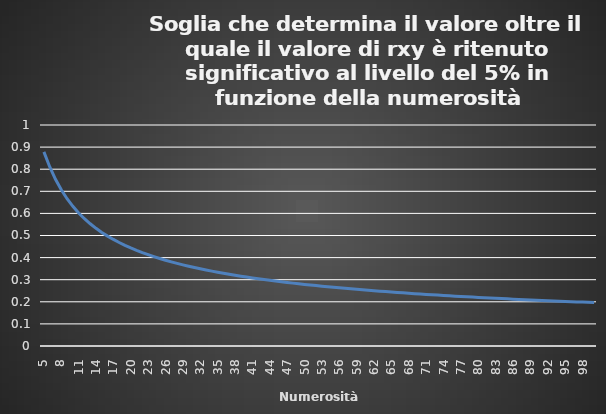
| Category | Series 0 |
|---|---|
| 5.0 | 0.878 |
| 6.0 | 0.811 |
| 7.0 | 0.754 |
| 8.0 | 0.707 |
| 9.0 | 0.666 |
| 10.0 | 0.632 |
| 11.0 | 0.602 |
| 12.0 | 0.576 |
| 13.0 | 0.553 |
| 14.0 | 0.532 |
| 15.0 | 0.514 |
| 16.0 | 0.497 |
| 17.0 | 0.482 |
| 18.0 | 0.468 |
| 19.0 | 0.456 |
| 20.0 | 0.444 |
| 21.0 | 0.433 |
| 22.0 | 0.423 |
| 23.0 | 0.413 |
| 24.0 | 0.404 |
| 25.0 | 0.396 |
| 26.0 | 0.388 |
| 27.0 | 0.381 |
| 28.0 | 0.374 |
| 29.0 | 0.367 |
| 30.0 | 0.361 |
| 31.0 | 0.355 |
| 32.0 | 0.349 |
| 33.0 | 0.344 |
| 34.0 | 0.339 |
| 35.0 | 0.334 |
| 36.0 | 0.329 |
| 37.0 | 0.325 |
| 38.0 | 0.32 |
| 39.0 | 0.316 |
| 40.0 | 0.312 |
| 41.0 | 0.308 |
| 42.0 | 0.304 |
| 43.0 | 0.301 |
| 44.0 | 0.297 |
| 45.0 | 0.294 |
| 46.0 | 0.291 |
| 47.0 | 0.288 |
| 48.0 | 0.285 |
| 49.0 | 0.282 |
| 50.0 | 0.279 |
| 51.0 | 0.276 |
| 52.0 | 0.273 |
| 53.0 | 0.271 |
| 54.0 | 0.268 |
| 55.0 | 0.266 |
| 56.0 | 0.263 |
| 57.0 | 0.261 |
| 58.0 | 0.259 |
| 59.0 | 0.256 |
| 60.0 | 0.254 |
| 61.0 | 0.252 |
| 62.0 | 0.25 |
| 63.0 | 0.248 |
| 64.0 | 0.246 |
| 65.0 | 0.244 |
| 66.0 | 0.242 |
| 67.0 | 0.24 |
| 68.0 | 0.239 |
| 69.0 | 0.237 |
| 70.0 | 0.235 |
| 71.0 | 0.234 |
| 72.0 | 0.232 |
| 73.0 | 0.23 |
| 74.0 | 0.229 |
| 75.0 | 0.227 |
| 76.0 | 0.226 |
| 77.0 | 0.224 |
| 78.0 | 0.223 |
| 79.0 | 0.221 |
| 80.0 | 0.22 |
| 81.0 | 0.219 |
| 82.0 | 0.217 |
| 83.0 | 0.216 |
| 84.0 | 0.215 |
| 85.0 | 0.213 |
| 86.0 | 0.212 |
| 87.0 | 0.211 |
| 88.0 | 0.21 |
| 89.0 | 0.208 |
| 90.0 | 0.207 |
| 91.0 | 0.206 |
| 92.0 | 0.205 |
| 93.0 | 0.204 |
| 94.0 | 0.203 |
| 95.0 | 0.202 |
| 96.0 | 0.201 |
| 97.0 | 0.2 |
| 98.0 | 0.199 |
| 99.0 | 0.198 |
| 100.0 | 0.197 |